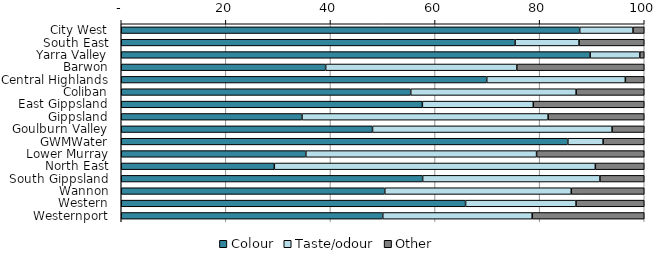
| Category | Colour | Taste/odour | Other |
|---|---|---|---|
| City West | 87.651 | 10.201 | 2.148 |
| South East | 75.306 | 12.225 | 12.469 |
| Yarra Valley | 89.659 | 9.489 | 0.852 |
| Barwon | 39.086 | 36.548 | 24.365 |
| Central Highlands | 69.88 | 26.506 | 3.614 |
| Coliban | 55.349 | 31.628 | 13.023 |
| East Gippsland | 57.576 | 21.212 | 21.212 |
| Gippsland | 34.559 | 47.059 | 18.382 |
| Goulburn Valley | 48.045 | 45.81 | 6.145 |
| GWMWater | 85.393 | 6.742 | 7.865 |
| Lower Murray | 35.294 | 44.118 | 20.588 |
| North East | 29.268 | 61.382 | 9.35 |
| South Gippsland | 57.627 | 33.898 | 8.475 |
| Wannon | 50.388 | 35.659 | 13.953 |
| Western | 65.839 | 21.118 | 13.043 |
| Westernport | 50 | 28.571 | 21.429 |